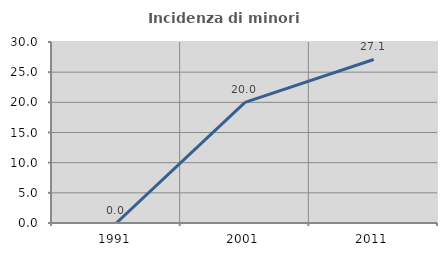
| Category | Incidenza di minori stranieri |
|---|---|
| 1991.0 | 0 |
| 2001.0 | 20 |
| 2011.0 | 27.103 |